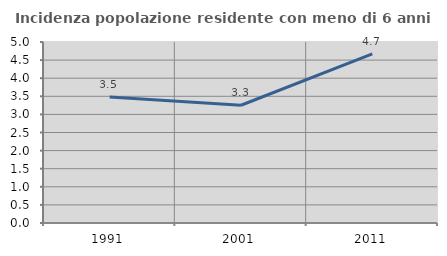
| Category | Incidenza popolazione residente con meno di 6 anni |
|---|---|
| 1991.0 | 3.479 |
| 2001.0 | 3.253 |
| 2011.0 | 4.67 |